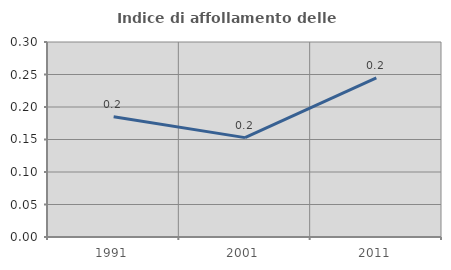
| Category | Indice di affollamento delle abitazioni  |
|---|---|
| 1991.0 | 0.185 |
| 2001.0 | 0.153 |
| 2011.0 | 0.245 |